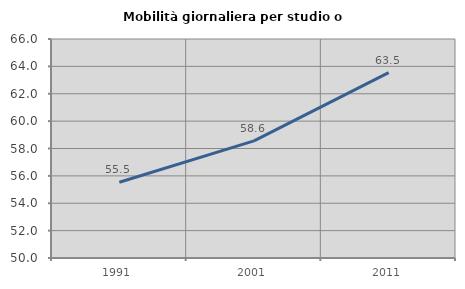
| Category | Mobilità giornaliera per studio o lavoro |
|---|---|
| 1991.0 | 55.53 |
| 2001.0 | 58.553 |
| 2011.0 | 63.548 |